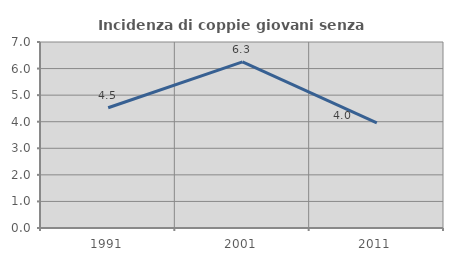
| Category | Incidenza di coppie giovani senza figli |
|---|---|
| 1991.0 | 4.525 |
| 2001.0 | 6.25 |
| 2011.0 | 3.953 |